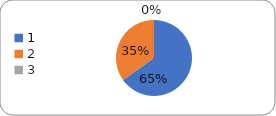
| Category | Series 0 |
|---|---|
| 0 | 75 |
| 1 | 40 |
| 2 | 0 |